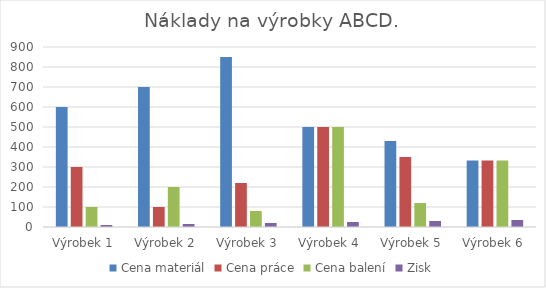
| Category | Cena materiál | Cena práce | Cena balení | Zisk |
|---|---|---|---|---|
| Výrobek 1 | 600 | 300 | 100 | 10 |
| Výrobek 2 | 700 | 100 | 200 | 15 |
| Výrobek 3 | 850 | 220 | 80 | 20 |
| Výrobek 4 | 500 | 500 | 500 | 25 |
| Výrobek 5 | 430 | 350 | 120 | 30 |
| Výrobek 6 | 333 | 333 | 333 | 35 |